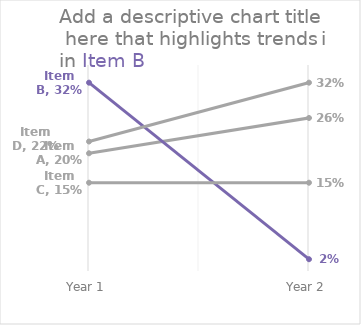
| Category | Item A | Item B | Item C | Item D |
|---|---|---|---|---|
| Year 1 | 0.2 | 0.32 | 0.15 | 0.22 |
| Year 2 | 0.26 | 0.02 | 0.15 | 0.32 |